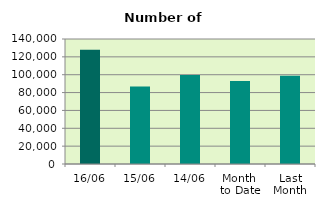
| Category | Series 0 |
|---|---|
| 16/06 | 127848 |
| 15/06 | 86796 |
| 14/06 | 99634 |
| Month 
to Date | 92878 |
| Last
Month | 98885.545 |